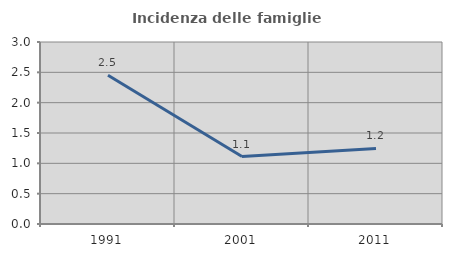
| Category | Incidenza delle famiglie numerose |
|---|---|
| 1991.0 | 2.451 |
| 2001.0 | 1.112 |
| 2011.0 | 1.246 |